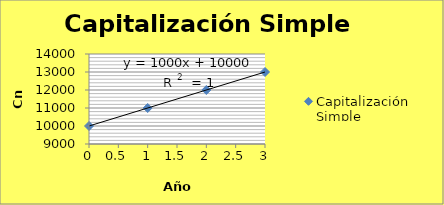
| Category | Capitalización Simple |
|---|---|
| 0.0 | 10000 |
| 1.0 | 11000 |
| 2.0 | 12000 |
| 3.0 | 13000 |